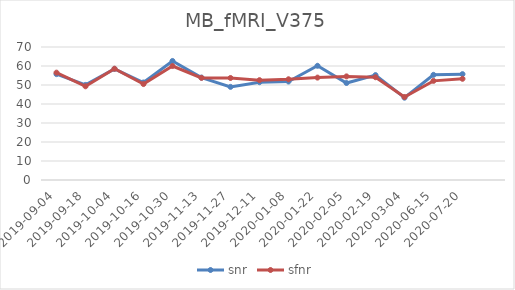
| Category | snr | sfnr |
|---|---|---|
| 2019-09-04 | 55.721 | 56.499 |
| 2019-09-18 | 50.04 | 49.321 |
| 2019-10-04 | 58.481 | 58.575 |
| 2019-10-16 | 51.317 | 50.497 |
| 2019-10-30 | 62.651 | 59.984 |
| 2019-11-13 | 53.918 | 53.739 |
| 2019-11-27 | 49.012 | 53.691 |
| 2019-12-11 | 51.475 | 52.56 |
| 2020-01-08 | 51.834 | 53.026 |
| 2020-01-22 | 60.107 | 53.897 |
| 2020-02-05 | 51.046 | 54.535 |
| 2020-02-19 | 55.219 | 54.088 |
| 2020-03-04 | 43.326 | 43.692 |
| 2020-06-15 | 55.353 | 52.178 |
| 2020-07-20 | 55.723 | 53.275 |